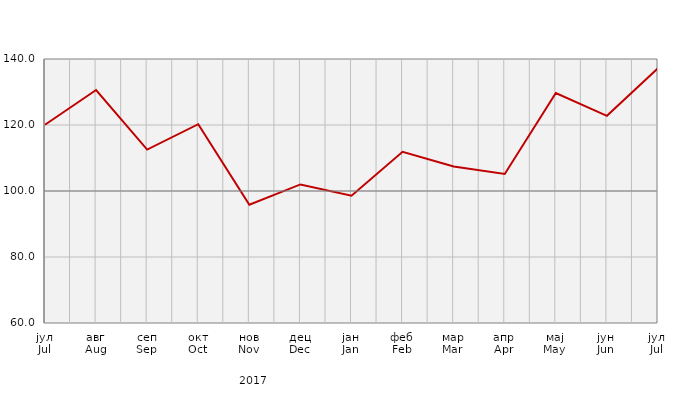
| Category | Индекси ноћења туриста
Tourist night indices |
|---|---|
| јул
Jul | 120.08 |
| авг
Aug | 130.596 |
| сеп
Sep | 112.544 |
| окт
Oct | 120.238 |
| нов
Nov | 95.857 |
| дец
Dec | 101.993 |
| јан
Jan | 98.549 |
| феб
Feb | 111.894 |
| мар
Mar | 107.417 |
| апр
Apr | 105.153 |
| мај
May | 129.708 |
| јун
Jun | 122.777 |
| јул
Jul | 137.197 |